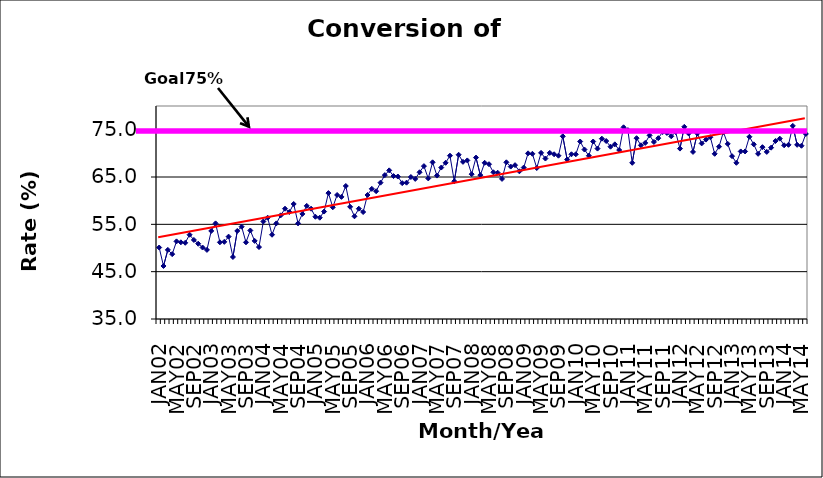
| Category | Series 0 |
|---|---|
| JAN02 | 50.1 |
| FEB02 | 46.2 |
| MAR02 | 49.6 |
| APR02 | 48.7 |
| MAY02 | 51.4 |
| JUN02 | 51.2 |
| JUL02 | 51.1 |
| AUG02 | 52.8 |
| SEP02 | 51.7 |
| OCT02 | 50.9 |
| NOV02 | 50.1 |
| DEC02 | 49.6 |
| JAN03 | 53.6 |
| FEB03 | 55.2 |
| MAR03 | 51.2 |
| APR03 | 51.3 |
| MAY03 | 52.4 |
| JUN03 | 48.1 |
| JUL03 | 53.6 |
| AUG03 | 54.5 |
| SEP03 | 51.2 |
| OCT03 | 53.7 |
| NOV03 | 51.5 |
| DEC03 | 50.2 |
| JAN04 | 55.6 |
| FEB04 | 56.4 |
| MAR04 | 52.8 |
| APR04 | 55.2 |
| MAY04 | 56.9 |
| JUN04 | 58.3 |
| JUL04 | 57.6 |
| AUG04 | 59.3 |
| SEP04 | 55.2 |
| OCT04 | 57.2 |
| NOV04 | 58.9 |
| DEC04 | 58.3 |
| JAN05 | 56.6 |
| FEB05 | 56.4 |
| MAR05 | 57.7 |
| APR05 | 61.6 |
| MAY05 | 58.6 |
| JUN05 | 61.2 |
| JUL05 | 60.8 |
| AUG05 | 63.1 |
| SEP05 | 58.7 |
| OCT05 | 56.7 |
| NOV05 | 58.3 |
| DEC05 | 57.6 |
| JAN06 | 61.2 |
| FEB06 | 62.5 |
| MAR06 | 62 |
| APR06 | 63.8 |
| MAY06 | 65.4 |
| JUN06 | 66.4 |
| JUL06 | 65.2 |
| AUG06 | 65.1 |
| SEP06 | 63.7 |
| OCT06 | 63.8 |
| NOV06 | 65 |
| DEC06 | 64.6 |
| JAN07 | 66 |
| FEB07 | 67.3 |
| MAR07 | 64.7 |
| APR07 | 68.1 |
| MAY07 | 65.3 |
| JUN07 | 67 |
| JUL07 | 68 |
| AUG07 | 69.5 |
| SEP07 | 64.1 |
| OCT07 | 69.7 |
| NOV07 | 68.2 |
| DEC07 | 68.5 |
| JAN08 | 65.6 |
| FEB08 | 69.1 |
| MAR08 | 65.4 |
| APR08 | 68 |
| MAY08 | 67.7 |
| JUN08 | 66 |
| JUL08 | 65.9 |
| AUG08 | 64.6 |
| SEP08 | 68.1 |
| OCT08 | 67.2 |
| NOV08 | 67.5 |
| DEC08 | 66.2 |
| JAN09 | 67 |
| FEB09 | 70 |
| MAR09 | 69.9 |
| APR09 | 66.9 |
| MAY09 | 70.1 |
| JUN09 | 68.9 |
| JUL09 | 70.1 |
| AUG09 | 69.8 |
| SEP09 | 69.5 |
| OCT09 | 73.6 |
| NOV09 | 68.7 |
| DEC09 | 69.8 |
| JAN10 | 69.8 |
| FEB10 | 72.5 |
| MAR10 | 70.8 |
| APR10 | 69.5 |
| MAY10 | 72.5 |
| JUN10 | 71 |
| JUL10 | 73.1 |
| AUG10 | 72.6 |
| SEP10 | 71.4 |
| OCT10 | 71.9 |
| NOV10 | 70.7 |
| DEC10 | 75.5 |
| JAN11 | 74.9 |
| FEB11 | 68 |
| MAR11 | 73.2 |
| APR11 | 71.7 |
| MAY11 | 72.2 |
| JUN11 | 73.8 |
| JUL11 | 72.4 |
| AUG11 | 73.2 |
| SEP11 | 74.5 |
| OCT11 | 74.3 |
| NOV11 | 73.6 |
| DEC11 | 74.5 |
| JAN12 | 71 |
| FEB12 | 75.6 |
| MAR12 | 74.2 |
| APR12 | 70.3 |
| MAY12 | 74.2 |
| JUN12 | 72.1 |
| JUL12 | 72.9 |
| AUG12 | 73.4 |
| SEP12 | 69.9 |
| OCT12 | 71.4 |
| NOV12 | 74.5 |
| DEC12 | 72 |
| JAN13 | 69.4 |
| FEB13 | 68 |
| MAR13 | 70.4 |
| APR13 | 70.4 |
| MAY13 | 73.5 |
| JUN13 | 71.9 |
| JUL13 | 69.9 |
| AUG13 | 71.3 |
| SEP13 | 70.3 |
| OCT13 | 71.2 |
| NOV13 | 72.6 |
| DEC13 | 73.1 |
| JAN14 | 71.7 |
| FEB14 | 71.8 |
| MAR14 | 75.8 |
| APR14 | 71.8 |
| MAY14 | 71.6 |
| JUN14 | 74.1 |